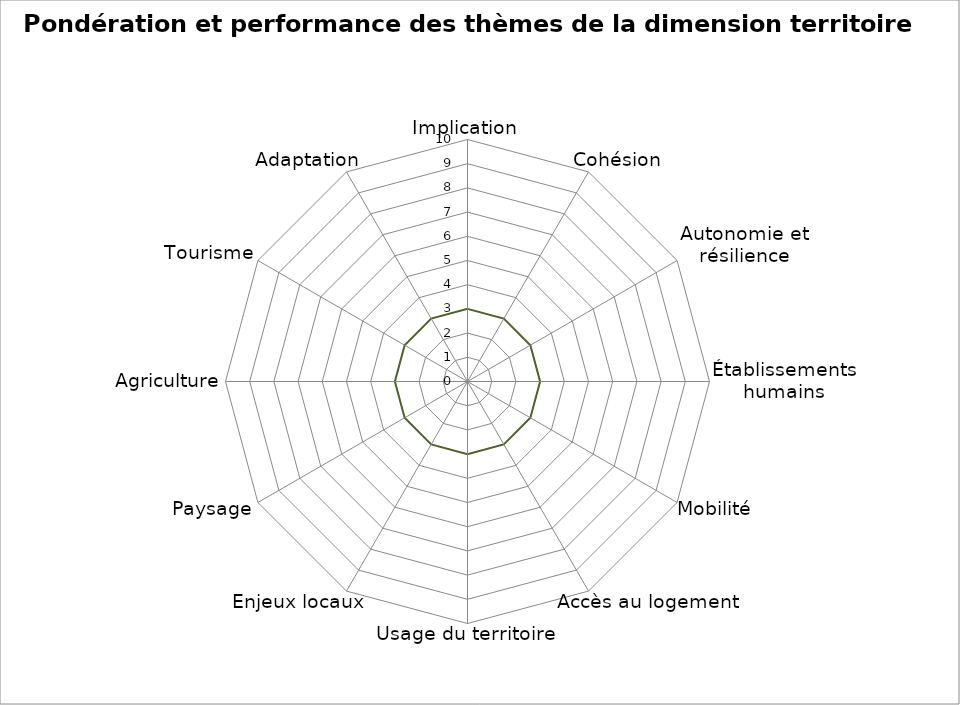
| Category | Performance | Pondération | Series 2 |
|---|---|---|---|
| Implication | 0 | 0 | 3 |
| Cohésion | 0 | 0 | 3 |
| Autonomie et résilience | 0 | 0 | 3 |
| Établissements humains | 0 | 0 | 3 |
| Mobilité | 0 | 0 | 3 |
| Accès au logement | 0 | 0 | 3 |
| Usage du territoire | 0 | 0 | 3 |
| Enjeux locaux | 0 | 0 | 3 |
| Paysage | 0 | 0 | 3 |
| Agriculture | 0 | 0 | 3 |
| Tourisme | 0 | 0 | 3 |
| Adaptation | 0 | 0 | 3 |